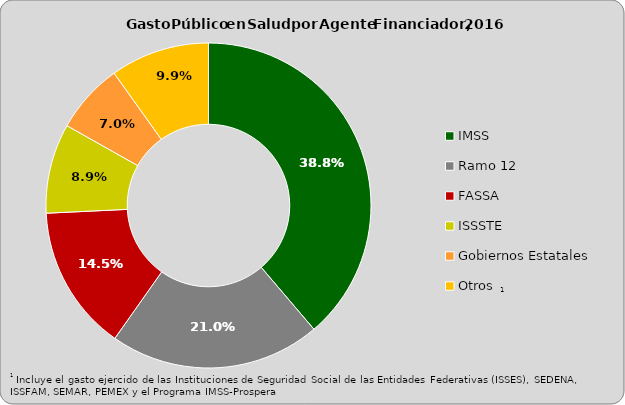
| Category | Series 0 |
|---|---|
| IMSS | 0.388 |
| Ramo 12 | 0.21 |
| FASSA | 0.145 |
| ISSSTE | 0.089 |
| Gobiernos Estatales | 0.07 |
| Otros | 0.099 |